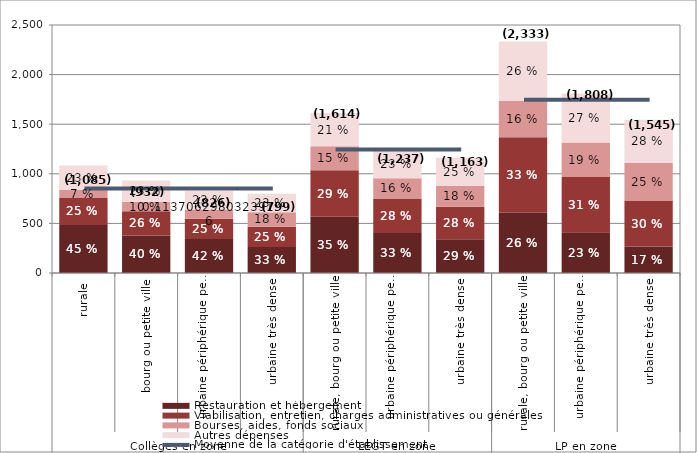
| Category | Restauration et hébergement | Viabilisation, entretien, charges administratives ou générales  | Bourses, aides, fonds sociaux | Autres dépenses  |
|---|---|---|---|---|
| 0 | 485.044 | 275.908 | 77.65 | 246.027 |
| 1 | 377.499 | 244.644 | 95.81 | 214.166 |
| 2 | 343.109 | 202.735 | 93.929 | 186.294 |
| 3 | 262.529 | 203.589 | 147.452 | 185.595 |
| 4 | 565.821 | 470.604 | 242.004 | 335.127 |
| 5 | 404.24 | 347.51 | 203.631 | 281.234 |
| 6 | 339.262 | 328.841 | 209.488 | 285.445 |
| 7 | 606.969 | 760.75 | 366.209 | 599.391 |
| 8 | 410.066 | 556.879 | 347.935 | 493.344 |
| 9 | 267.132 | 463.157 | 379.808 | 435.401 |